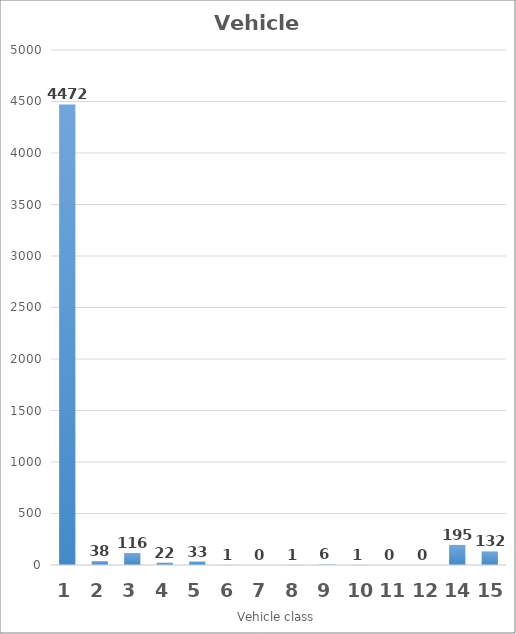
| Category | Series 0 |
|---|---|
| 1.0 | 4472 |
| 2.0 | 38 |
| 3.0 | 116 |
| 4.0 | 22 |
| 5.0 | 33 |
| 6.0 | 1 |
| 7.0 | 0 |
| 8.0 | 1 |
| 9.0 | 6 |
| 10.0 | 1 |
| 11.0 | 0 |
| 12.0 | 0 |
| 14.0 | 195 |
| 15.0 | 132 |